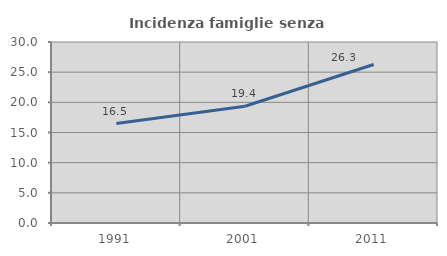
| Category | Incidenza famiglie senza nuclei |
|---|---|
| 1991.0 | 16.49 |
| 2001.0 | 19.355 |
| 2011.0 | 26.272 |